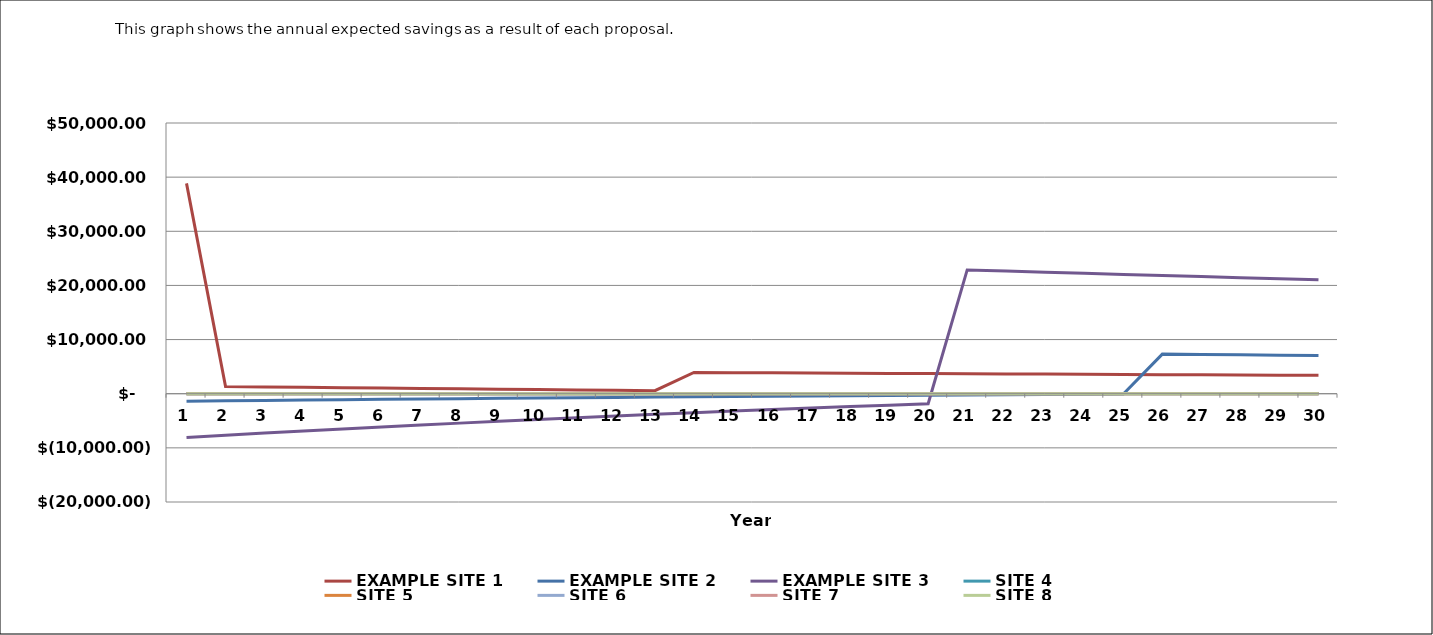
| Category | EXAMPLE SITE 1 | EXAMPLE SITE 2 | EXAMPLE SITE 3 | SITE 4 | SITE 5 | SITE 6 | SITE 7 | SITE 8 |
|---|---|---|---|---|---|---|---|---|
| 0 | 38848.585 | -1378.247 | -8081.459 | 0 | 0 | 0 | 0 | 0 |
| 1 | 1316.656 | -1307.319 | -7674.253 | 0 | 0 | 0 | 0 | 0 |
| 2 | 1247.324 | -1237.894 | -7276.947 | 0 | 0 | 0 | 0 | 0 |
| 3 | 1178.084 | -1169.948 | -6889.337 | 0 | 0 | 0 | 0 | 0 |
| 4 | 1108.928 | -1103.454 | -6511.222 | 0 | 0 | 0 | 0 | 0 |
| 5 | 1039.851 | -1038.386 | -6142.403 | 0 | 0 | 0 | 0 | 0 |
| 6 | 970.848 | -974.719 | -5782.689 | 0 | 0 | 0 | 0 | 0 |
| 7 | 901.912 | -912.429 | -5431.889 | 0 | 0 | 0 | 0 | 0 |
| 8 | 833.037 | -851.492 | -5089.819 | 0 | 0 | 0 | 0 | 0 |
| 9 | 764.217 | -791.884 | -4756.295 | 0 | 0 | 0 | 0 | 0 |
| 10 | 695.446 | -733.581 | -4431.139 | 0 | 0 | 0 | 0 | 0 |
| 11 | 626.718 | -676.56 | -4114.177 | 0 | 0 | 0 | 0 | 0 |
| 12 | 558.028 | -620.798 | -3805.236 | 0 | 0 | 0 | 0 | 0 |
| 13 | 3930.328 | -566.274 | -3504.148 | 0 | 0 | 0 | 0 | 0 |
| 14 | 3894.351 | -512.964 | -3210.749 | 0 | 0 | 0 | 0 | 0 |
| 15 | 3858.702 | -460.848 | -2924.876 | 0 | 0 | 0 | 0 | 0 |
| 16 | 3823.38 | -409.905 | -2646.371 | 0 | 0 | 0 | 0 | 0 |
| 17 | 3788.381 | -360.113 | -2375.079 | 0 | 0 | 0 | 0 | 0 |
| 18 | 3753.703 | -311.451 | -2110.847 | 0 | 0 | 0 | 0 | 0 |
| 19 | 3719.342 | -263.9 | -1853.526 | 0 | 0 | 0 | 0 | 0 |
| 20 | 3685.295 | -217.44 | 22863.798 | 0 | 0 | 0 | 0 | 0 |
| 21 | 3651.561 | -172.051 | 22654.506 | 0 | 0 | 0 | 0 | 0 |
| 22 | 3618.135 | -127.713 | 22447.129 | 0 | 0 | 0 | 0 | 0 |
| 23 | 3585.015 | -84.408 | 22241.651 | 0 | 0 | 0 | 0 | 0 |
| 24 | 3552.198 | -42.117 | 22038.053 | 0 | 0 | 0 | 0 | 0 |
| 25 | 3519.682 | 7319.81 | 21836.32 | 0 | 0 | 0 | 0 | 0 |
| 26 | 3487.463 | 7252.806 | 21636.432 | 0 | 0 | 0 | 0 | 0 |
| 27 | 3455.539 | 7186.414 | 21438.375 | 0 | 0 | 0 | 0 | 0 |
| 28 | 3423.907 | 7120.631 | 21242.131 | 0 | 0 | 0 | 0 | 0 |
| 29 | 3392.565 | 7055.449 | 21047.683 | 0 | 0 | 0 | 0 | 0 |